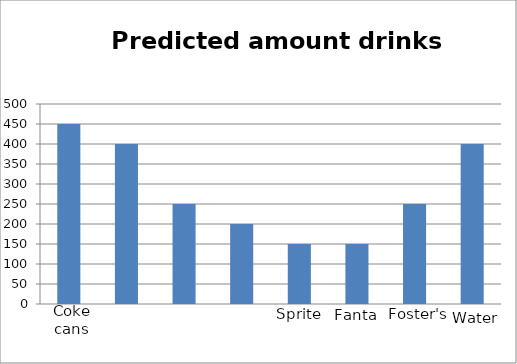
| Category | coke cans small coke bottles Budweiser Smirnoff sprite Fanta Foster's Water |
|---|---|
| 0 | 450 |
| 1 | 400 |
| 2 | 250 |
| 3 | 200 |
| 4 | 150 |
| 5 | 150 |
| 6 | 250 |
| 7 | 400 |